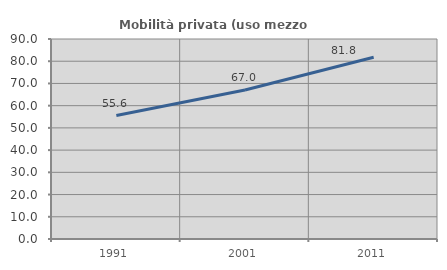
| Category | Mobilità privata (uso mezzo privato) |
|---|---|
| 1991.0 | 55.556 |
| 2001.0 | 67.033 |
| 2011.0 | 81.818 |